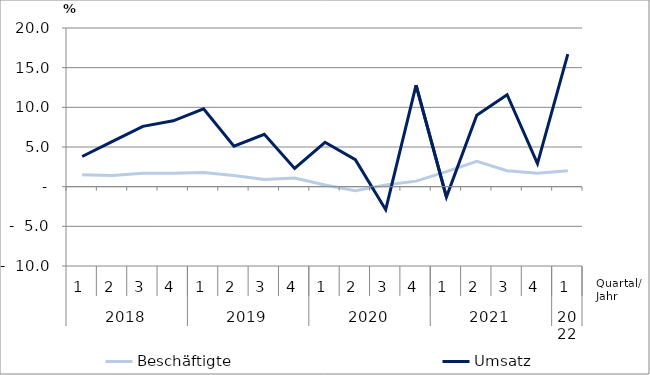
| Category | Beschäftigte | Umsatz |
|---|---|---|
| 0 | 1.5 | 3.8 |
| 1 | 1.4 | 5.7 |
| 2 | 1.7 | 7.6 |
| 3 | 1.7 | 8.3 |
| 4 | 1.8 | 9.8 |
| 5 | 1.4 | 5.1 |
| 6 | 0.9 | 6.6 |
| 7 | 1.1 | 2.3 |
| 8 | 0.2 | 5.6 |
| 9 | -0.5 | 3.4 |
| 10 | 0.2 | -2.9 |
| 11 | 0.7 | 12.8 |
| 12 | 1.9 | -1.3 |
| 13 | 3.2 | 9 |
| 14 | 2 | 11.6 |
| 15 | 1.7 | 2.9 |
| 16 | 2 | 16.7 |